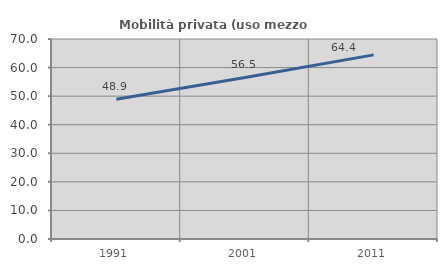
| Category | Mobilità privata (uso mezzo privato) |
|---|---|
| 1991.0 | 48.896 |
| 2001.0 | 56.537 |
| 2011.0 | 64.438 |